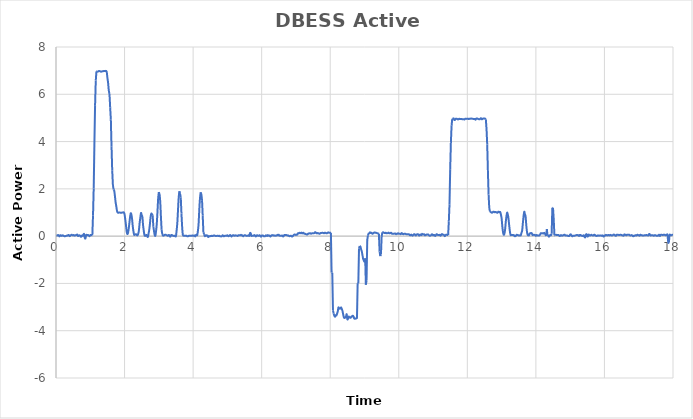
| Category | DBESS Active Power |
|---|---|
| 0.0 | -0.006 |
| 0.02 | 0.027 |
| 0.04 | 0.028 |
| 0.06 | 0.048 |
| 0.08 | 0.03 |
| 0.1 | -0.011 |
| 0.12 | 0.033 |
| 0.14 | 0.041 |
| 0.16 | 0.011 |
| 0.18 | 0.02 |
| 0.2 | 0.035 |
| 0.22 | 0.014 |
| 0.24 | 0.002 |
| 0.26 | -0.007 |
| 0.28 | 0.004 |
| 0.3 | 0.014 |
| 0.32 | 0.022 |
| 0.34 | 0.022 |
| 0.36 | 0.047 |
| 0.38 | 0.039 |
| 0.4 | 0 |
| 0.42 | 0.026 |
| 0.44 | 0.047 |
| 0.46 | 0.057 |
| 0.48 | 0.04 |
| 0.5 | 0.034 |
| 0.52 | 0.047 |
| 0.54 | 0.021 |
| 0.56 | 0.031 |
| 0.58 | 0.041 |
| 0.6 | 0.052 |
| 0.62 | 0.065 |
| 0.64 | 0.008 |
| 0.66 | 0.017 |
| 0.68 | 0.037 |
| 0.7 | 0.023 |
| 0.72 | -0.018 |
| 0.74 | -0.021 |
| 0.76 | 0.029 |
| 0.78 | 0.014 |
| 0.8 | 0.068 |
| 0.82 | 0.088 |
| 0.84 | -0.074 |
| 0.86 | -0.094 |
| 0.88 | 0.041 |
| 0.9 | 0.054 |
| 0.92 | 0.04 |
| 0.94 | 0.045 |
| 0.96 | 0.019 |
| 0.98 | -0.002 |
| 1.0 | 0.042 |
| 1.02 | 0.048 |
| 1.04 | 0.043 |
| 1.06 | 0.038 |
| 1.08 | 0.88 |
| 1.1 | 2.011 |
| 1.12 | 3.896 |
| 1.14 | 5.542 |
| 1.16 | 6.577 |
| 1.18 | 6.971 |
| 1.2 | 6.971 |
| 1.22 | 6.956 |
| 1.24 | 6.977 |
| 1.26 | 6.982 |
| 1.28 | 6.976 |
| 1.3 | 6.963 |
| 1.32 | 6.956 |
| 1.34 | 6.967 |
| 1.36 | 6.978 |
| 1.38 | 6.978 |
| 1.4 | 6.986 |
| 1.42 | 6.986 |
| 1.44 | 6.98 |
| 1.46 | 6.989 |
| 1.48 | 6.942 |
| 1.5 | 6.695 |
| 1.52 | 6.484 |
| 1.54 | 6.161 |
| 1.56 | 6.015 |
| 1.58 | 5.454 |
| 1.6 | 4.923 |
| 1.62 | 3.784 |
| 1.64 | 2.784 |
| 1.66 | 2.162 |
| 1.68 | 1.976 |
| 1.7 | 1.915 |
| 1.72 | 1.686 |
| 1.74 | 1.424 |
| 1.76 | 1.254 |
| 1.78 | 1.062 |
| 1.8 | 1.002 |
| 1.82 | 0.985 |
| 1.84 | 1.002 |
| 1.86 | 1 |
| 1.88 | 0.99 |
| 1.9 | 0.993 |
| 1.92 | 0.993 |
| 1.94 | 1 |
| 1.96 | 1.003 |
| 1.98 | 1.003 |
| 2.0 | 0.924 |
| 2.02 | 0.716 |
| 2.04 | 0.48 |
| 2.06 | 0.203 |
| 2.08 | 0.09 |
| 2.1 | 0.13 |
| 2.12 | 0.303 |
| 2.14 | 0.543 |
| 2.16 | 0.802 |
| 2.18 | 0.967 |
| 2.2 | 0.907 |
| 2.22 | 0.716 |
| 2.24 | 0.408 |
| 2.26 | 0.2 |
| 2.28 | 0.057 |
| 2.3 | 0.064 |
| 2.32 | 0.077 |
| 2.34 | 0.077 |
| 2.36 | 0.038 |
| 2.38 | 0.038 |
| 2.4 | 0.1 |
| 2.42 | 0.258 |
| 2.44 | 0.555 |
| 2.46 | 0.784 |
| 2.48 | 0.979 |
| 2.5 | 0.885 |
| 2.52 | 0.812 |
| 2.54 | 0.465 |
| 2.56 | 0.232 |
| 2.58 | 0.045 |
| 2.6 | 0.01 |
| 2.62 | 0.034 |
| 2.64 | 0.05 |
| 2.66 | 0.004 |
| 2.68 | -0.035 |
| 2.7 | 0.105 |
| 2.72 | 0.266 |
| 2.74 | 0.514 |
| 2.76 | 0.807 |
| 2.78 | 0.952 |
| 2.8 | 0.925 |
| 2.82 | 0.88 |
| 2.84 | 0.402 |
| 2.86 | 0.208 |
| 2.88 | 0.044 |
| 2.9 | 0.026 |
| 2.92 | 0.224 |
| 2.94 | 0.522 |
| 2.96 | 1.023 |
| 2.98 | 1.588 |
| 3.0 | 1.863 |
| 3.02 | 1.788 |
| 3.04 | 1.479 |
| 3.06 | 0.853 |
| 3.08 | 0.273 |
| 3.1 | 0.088 |
| 3.12 | 0.024 |
| 3.14 | 0.024 |
| 3.16 | 0.042 |
| 3.18 | 0.057 |
| 3.2 | 0.059 |
| 3.22 | 0.042 |
| 3.24 | 0.032 |
| 3.26 | 0.014 |
| 3.28 | 0.039 |
| 3.3 | 0.046 |
| 3.32 | -0.013 |
| 3.34 | -0.015 |
| 3.36 | 0.046 |
| 3.38 | 0.047 |
| 3.4 | 0.025 |
| 3.42 | 0.011 |
| 3.44 | 0.014 |
| 3.46 | 0.014 |
| 3.48 | -0.007 |
| 3.5 | 0.01 |
| 3.52 | 0.254 |
| 3.54 | 0.576 |
| 3.56 | 1.122 |
| 3.58 | 1.645 |
| 3.6 | 1.898 |
| 3.62 | 1.787 |
| 3.64 | 1.633 |
| 3.66 | 0.953 |
| 3.68 | 0.396 |
| 3.7 | 0.064 |
| 3.72 | 0.019 |
| 3.74 | 0.015 |
| 3.76 | 0.014 |
| 3.78 | 0.018 |
| 3.8 | 0.019 |
| 3.82 | 0.002 |
| 3.84 | -0.005 |
| 3.86 | 0.001 |
| 3.88 | 0.017 |
| 3.9 | 0.018 |
| 3.92 | 0.015 |
| 3.94 | 0.017 |
| 3.96 | 0.016 |
| 3.98 | 0.032 |
| 4.0 | 0.015 |
| 4.02 | 0.018 |
| 4.04 | 0.027 |
| 4.06 | -0.012 |
| 4.08 | 0.035 |
| 4.1 | 0.062 |
| 4.12 | 0.042 |
| 4.14 | 0.222 |
| 4.16 | 0.518 |
| 4.18 | 1.113 |
| 4.2 | 1.594 |
| 4.22 | 1.852 |
| 4.24 | 1.779 |
| 4.26 | 1.523 |
| 4.28 | 0.875 |
| 4.3 | 0.165 |
| 4.32 | 0.081 |
| 4.34 | 0.002 |
| 4.36 | 0.021 |
| 4.38 | 0.042 |
| 4.4 | 0.015 |
| 4.42 | 0.024 |
| 4.44 | -0.039 |
| 4.46 | 0.001 |
| 4.48 | -0.011 |
| 4.5 | 0.001 |
| 4.52 | 0.001 |
| 4.54 | 0.016 |
| 4.56 | 0.008 |
| 4.58 | 0.008 |
| 4.6 | 0.028 |
| 4.62 | 0.028 |
| 4.64 | 0.014 |
| 4.66 | 0.01 |
| 4.68 | 0.009 |
| 4.7 | 0.013 |
| 4.72 | 0.013 |
| 4.74 | 0.005 |
| 4.76 | 0.019 |
| 4.78 | -0.002 |
| 4.8 | -0.008 |
| 4.82 | -0.012 |
| 4.84 | -0.001 |
| 4.86 | 0.036 |
| 4.88 | 0.011 |
| 4.9 | -0.007 |
| 4.92 | 0.008 |
| 4.94 | 0.02 |
| 4.96 | 0.011 |
| 4.98 | 0.021 |
| 5.0 | 0.037 |
| 5.02 | 0.001 |
| 5.04 | 0.001 |
| 5.06 | 0.019 |
| 5.08 | 0.05 |
| 5.1 | 0.017 |
| 5.12 | -0.017 |
| 5.14 | 0.018 |
| 5.16 | 0.036 |
| 5.18 | 0.036 |
| 5.2 | 0.016 |
| 5.22 | 0.029 |
| 5.24 | 0.034 |
| 5.26 | 0.025 |
| 5.28 | 0.02 |
| 5.3 | 0.01 |
| 5.32 | 0.037 |
| 5.34 | 0.038 |
| 5.36 | 0.037 |
| 5.38 | 0.037 |
| 5.4 | 0.056 |
| 5.42 | 0.032 |
| 5.44 | 0.032 |
| 5.46 | -0.006 |
| 5.48 | 0.019 |
| 5.5 | 0.037 |
| 5.52 | 0.038 |
| 5.54 | 0.022 |
| 5.56 | 0.011 |
| 5.58 | 0.019 |
| 5.6 | 0.02 |
| 5.62 | 0.041 |
| 5.64 | 0.01 |
| 5.66 | 0.127 |
| 5.68 | 0.122 |
| 5.7 | 0.014 |
| 5.72 | 0.014 |
| 5.74 | 0.018 |
| 5.76 | 0.018 |
| 5.78 | 0.04 |
| 5.8 | 0.04 |
| 5.82 | -0.006 |
| 5.84 | -0.006 |
| 5.86 | 0.033 |
| 5.88 | 0.033 |
| 5.9 | 0.017 |
| 5.92 | 0.017 |
| 5.94 | 0.038 |
| 5.96 | 0.01 |
| 5.98 | -0.025 |
| 6.0 | 0.021 |
| 6.02 | 0.028 |
| 6.04 | 0.028 |
| 6.06 | -0.007 |
| 6.08 | -0.001 |
| 6.1 | -0.001 |
| 6.12 | 0.032 |
| 6.14 | 0.028 |
| 6.16 | 0.005 |
| 6.18 | 0.044 |
| 6.2 | 0.021 |
| 6.22 | 0.028 |
| 6.24 | 0.001 |
| 6.26 | -0.013 |
| 6.28 | 0.031 |
| 6.3 | 0.031 |
| 6.32 | 0.044 |
| 6.34 | 0.036 |
| 6.36 | 0.018 |
| 6.38 | 0.032 |
| 6.4 | 0.021 |
| 6.42 | 0.021 |
| 6.44 | 0.03 |
| 6.46 | 0.055 |
| 6.48 | 0.038 |
| 6.5 | 0.059 |
| 6.52 | 0.02 |
| 6.54 | 0.02 |
| 6.56 | 0.011 |
| 6.58 | 0.02 |
| 6.6 | 0.024 |
| 6.62 | -0.008 |
| 6.64 | -0.004 |
| 6.66 | 0.045 |
| 6.68 | 0.045 |
| 6.7 | 0.053 |
| 6.72 | 0.045 |
| 6.74 | 0.035 |
| 6.76 | 0.025 |
| 6.78 | 0.028 |
| 6.8 | 0.004 |
| 6.82 | -0.001 |
| 6.84 | 0.014 |
| 6.86 | 0.014 |
| 6.88 | -0.015 |
| 6.9 | -0.008 |
| 6.92 | 0.023 |
| 6.94 | 0.053 |
| 6.96 | 0.069 |
| 6.98 | 0.06 |
| 7.0 | 0.049 |
| 7.02 | 0.066 |
| 7.04 | 0.066 |
| 7.06 | 0.12 |
| 7.08 | 0.12 |
| 7.1 | 0.143 |
| 7.12 | 0.124 |
| 7.14 | 0.13 |
| 7.16 | 0.149 |
| 7.18 | 0.115 |
| 7.2 | 0.136 |
| 7.22 | 0.141 |
| 7.24 | 0.102 |
| 7.26 | 0.102 |
| 7.28 | 0.089 |
| 7.3 | 0.079 |
| 7.32 | 0.065 |
| 7.34 | 0.08 |
| 7.36 | 0.107 |
| 7.38 | 0.111 |
| 7.4 | 0.121 |
| 7.42 | 0.121 |
| 7.44 | 0.102 |
| 7.46 | 0.114 |
| 7.48 | 0.123 |
| 7.5 | 0.125 |
| 7.52 | 0.125 |
| 7.54 | 0.132 |
| 7.56 | 0.167 |
| 7.58 | 0.154 |
| 7.6 | 0.117 |
| 7.62 | 0.135 |
| 7.64 | 0.119 |
| 7.66 | 0.123 |
| 7.68 | 0.101 |
| 7.7 | 0.107 |
| 7.72 | 0.129 |
| 7.74 | 0.135 |
| 7.76 | 0.139 |
| 7.78 | 0.139 |
| 7.8 | 0.135 |
| 7.82 | 0.123 |
| 7.84 | 0.142 |
| 7.86 | 0.142 |
| 7.88 | 0.123 |
| 7.9 | 0.12 |
| 7.92 | 0.137 |
| 7.94 | 0.161 |
| 7.96 | 0.147 |
| 7.98 | 0.147 |
| 8.0 | 0.147 |
| 8.02 | 0.144 |
| 8.04 | -1.536 |
| 8.06 | -1.55 |
| 8.08 | -3.137 |
| 8.1 | -3.273 |
| 8.12 | -3.368 |
| 8.14 | -3.41 |
| 8.16 | -3.35 |
| 8.18 | -3.356 |
| 8.2 | -3.278 |
| 8.22 | -3.184 |
| 8.24 | -3.014 |
| 8.26 | -3.059 |
| 8.28 | -3.071 |
| 8.3 | -3.054 |
| 8.32 | -3.018 |
| 8.34 | -3.091 |
| 8.36 | -3.175 |
| 8.38 | -3.325 |
| 8.4 | -3.442 |
| 8.42 | -3.461 |
| 8.44 | -3.443 |
| 8.46 | -3.409 |
| 8.48 | -3.299 |
| 8.5 | -3.515 |
| 8.52 | -3.488 |
| 8.54 | -3.405 |
| 8.56 | -3.429 |
| 8.58 | -3.45 |
| 8.6 | -3.448 |
| 8.62 | -3.395 |
| 8.64 | -3.395 |
| 8.66 | -3.363 |
| 8.68 | -3.401 |
| 8.7 | -3.479 |
| 8.72 | -3.498 |
| 8.74 | -3.482 |
| 8.76 | -3.48 |
| 8.78 | -3.497 |
| 8.8 | -1.992 |
| 8.82 | -1.992 |
| 8.84 | -0.522 |
| 8.86 | -0.416 |
| 8.88 | -0.439 |
| 8.9 | -0.554 |
| 8.92 | -0.645 |
| 8.94 | -0.794 |
| 8.96 | -0.958 |
| 8.98 | -1.027 |
| 9.0 | -1.077 |
| 9.02 | -0.94 |
| 9.04 | -2.053 |
| 9.06 | -1.88 |
| 9.08 | -0.167 |
| 9.1 | 0.03 |
| 9.12 | 0.111 |
| 9.14 | 0.122 |
| 9.16 | 0.161 |
| 9.18 | 0.136 |
| 9.2 | 0.141 |
| 9.22 | 0.11 |
| 9.24 | 0.103 |
| 9.26 | 0.138 |
| 9.28 | 0.143 |
| 9.3 | 0.16 |
| 9.32 | 0.139 |
| 9.34 | 0.139 |
| 9.36 | 0.133 |
| 9.38 | 0.117 |
| 9.4 | 0.115 |
| 9.42 | 0.097 |
| 9.44 | -0.654 |
| 9.46 | -0.843 |
| 9.48 | -0.77 |
| 9.5 | -0.032 |
| 9.52 | 0.163 |
| 9.54 | 0.163 |
| 9.56 | 0.148 |
| 9.58 | 0.136 |
| 9.6 | 0.127 |
| 9.62 | 0.142 |
| 9.64 | 0.126 |
| 9.66 | 0.126 |
| 9.68 | 0.13 |
| 9.7 | 0.149 |
| 9.72 | 0.123 |
| 9.74 | 0.12 |
| 9.76 | 0.137 |
| 9.78 | 0.14 |
| 9.8 | 0.101 |
| 9.82 | 0.097 |
| 9.84 | 0.099 |
| 9.86 | 0.102 |
| 9.88 | 0.11 |
| 9.9 | 0.11 |
| 9.92 | 0.082 |
| 9.94 | 0.101 |
| 9.96 | 0.101 |
| 9.98 | 0.122 |
| 10.0 | 0.101 |
| 10.02 | 0.104 |
| 10.04 | 0.097 |
| 10.06 | 0.085 |
| 10.08 | 0.128 |
| 10.1 | 0.114 |
| 10.12 | 0.089 |
| 10.14 | 0.083 |
| 10.16 | 0.102 |
| 10.18 | 0.102 |
| 10.2 | 0.095 |
| 10.22 | 0.078 |
| 10.24 | 0.078 |
| 10.26 | 0.076 |
| 10.28 | 0.078 |
| 10.3 | 0.076 |
| 10.32 | 0.042 |
| 10.34 | 0.034 |
| 10.36 | 0.065 |
| 10.38 | 0.044 |
| 10.4 | 0.018 |
| 10.42 | 0.043 |
| 10.44 | 0.075 |
| 10.46 | 0.082 |
| 10.48 | 0.045 |
| 10.5 | 0.028 |
| 10.52 | 0.069 |
| 10.54 | 0.082 |
| 10.56 | 0.082 |
| 10.58 | 0.039 |
| 10.6 | 0.024 |
| 10.62 | 0.064 |
| 10.64 | 0.064 |
| 10.66 | 0.042 |
| 10.68 | 0.098 |
| 10.7 | 0.067 |
| 10.72 | 0.076 |
| 10.74 | 0.08 |
| 10.76 | 0.035 |
| 10.78 | 0.042 |
| 10.8 | 0.064 |
| 10.82 | 0.061 |
| 10.84 | 0.074 |
| 10.86 | 0.068 |
| 10.88 | 0.043 |
| 10.9 | 0.015 |
| 10.92 | 0.024 |
| 10.94 | 0.035 |
| 10.96 | 0.072 |
| 10.98 | 0.071 |
| 11.0 | 0.032 |
| 11.02 | 0.049 |
| 11.04 | 0.046 |
| 11.06 | 0.009 |
| 11.08 | 0.027 |
| 11.1 | 0.078 |
| 11.12 | 0.071 |
| 11.14 | 0.049 |
| 11.16 | 0.046 |
| 11.18 | 0.048 |
| 11.2 | 0.055 |
| 11.22 | 0.017 |
| 11.24 | 0.061 |
| 11.26 | 0.087 |
| 11.28 | 0.063 |
| 11.3 | 0.061 |
| 11.32 | 0.052 |
| 11.34 | 0 |
| 11.36 | 0.033 |
| 11.38 | 0.062 |
| 11.4 | 0.062 |
| 11.42 | 0.048 |
| 11.44 | 0.048 |
| 11.46 | 0.626 |
| 11.48 | 1.352 |
| 11.5 | 2.835 |
| 11.52 | 3.945 |
| 11.54 | 4.666 |
| 11.56 | 4.961 |
| 11.58 | 4.963 |
| 11.6 | 4.979 |
| 11.62 | 4.914 |
| 11.64 | 4.918 |
| 11.66 | 4.963 |
| 11.68 | 4.968 |
| 11.7 | 4.959 |
| 11.72 | 4.94 |
| 11.74 | 4.94 |
| 11.76 | 4.965 |
| 11.78 | 4.952 |
| 11.8 | 4.958 |
| 11.82 | 4.958 |
| 11.84 | 4.952 |
| 11.86 | 4.941 |
| 11.88 | 4.942 |
| 11.9 | 4.942 |
| 11.92 | 4.936 |
| 11.94 | 4.964 |
| 11.96 | 4.964 |
| 11.98 | 4.959 |
| 12.0 | 4.964 |
| 12.02 | 4.969 |
| 12.04 | 4.952 |
| 12.06 | 4.962 |
| 12.08 | 4.962 |
| 12.1 | 4.971 |
| 12.12 | 4.971 |
| 12.14 | 4.966 |
| 12.16 | 4.966 |
| 12.18 | 4.955 |
| 12.2 | 4.959 |
| 12.22 | 4.957 |
| 12.24 | 4.924 |
| 12.26 | 4.973 |
| 12.28 | 4.98 |
| 12.3 | 4.969 |
| 12.32 | 4.953 |
| 12.34 | 4.946 |
| 12.36 | 4.941 |
| 12.38 | 4.972 |
| 12.4 | 4.988 |
| 12.42 | 4.942 |
| 12.44 | 4.951 |
| 12.46 | 4.973 |
| 12.48 | 4.977 |
| 12.5 | 4.976 |
| 12.52 | 4.971 |
| 12.54 | 4.94 |
| 12.56 | 4.531 |
| 12.58 | 3.875 |
| 12.6 | 2.761 |
| 12.62 | 1.763 |
| 12.64 | 1.188 |
| 12.66 | 1.034 |
| 12.68 | 1.023 |
| 12.7 | 1.004 |
| 12.72 | 0.989 |
| 12.74 | 1.013 |
| 12.76 | 1.034 |
| 12.78 | 1.027 |
| 12.8 | 1.011 |
| 12.82 | 1.023 |
| 12.84 | 1.013 |
| 12.86 | 1.001 |
| 12.88 | 0.988 |
| 12.9 | 1.032 |
| 12.92 | 1.029 |
| 12.94 | 1.007 |
| 12.96 | 1.016 |
| 12.98 | 0.909 |
| 13.0 | 0.753 |
| 13.02 | 0.426 |
| 13.04 | 0.177 |
| 13.06 | 0.061 |
| 13.08 | 0.096 |
| 13.1 | 0.251 |
| 13.12 | 0.576 |
| 13.14 | 0.828 |
| 13.16 | 0.994 |
| 13.18 | 0.92 |
| 13.2 | 0.749 |
| 13.22 | 0.473 |
| 13.24 | 0.219 |
| 13.26 | 0.056 |
| 13.28 | 0.049 |
| 13.3 | 0.048 |
| 13.32 | 0.048 |
| 13.34 | 0.042 |
| 13.36 | 0.042 |
| 13.38 | 0.001 |
| 13.4 | 0.001 |
| 13.42 | 0.017 |
| 13.44 | 0.061 |
| 13.46 | 0.044 |
| 13.48 | 0.044 |
| 13.5 | 0.025 |
| 13.52 | 0.025 |
| 13.54 | 0.041 |
| 13.56 | 0.035 |
| 13.58 | 0.142 |
| 13.6 | 0.241 |
| 13.62 | 0.547 |
| 13.64 | 0.836 |
| 13.66 | 1.034 |
| 13.68 | 0.928 |
| 13.7 | 0.828 |
| 13.72 | 0.459 |
| 13.74 | 0.186 |
| 13.76 | 0.052 |
| 13.78 | 0.038 |
| 13.8 | 0.034 |
| 13.82 | 0.112 |
| 13.84 | 0.122 |
| 13.86 | 0.131 |
| 13.88 | 0.123 |
| 13.9 | 0.048 |
| 13.92 | 0.051 |
| 13.94 | 0.057 |
| 13.96 | 0.051 |
| 13.98 | 0.042 |
| 14.0 | 0.009 |
| 14.02 | 0.046 |
| 14.04 | 0.035 |
| 14.06 | 0.023 |
| 14.08 | 0.023 |
| 14.1 | 0.027 |
| 14.12 | 0.06 |
| 14.14 | 0.119 |
| 14.16 | 0.121 |
| 14.18 | 0.116 |
| 14.2 | 0.123 |
| 14.22 | 0.109 |
| 14.24 | 0.14 |
| 14.26 | 0.114 |
| 14.28 | 0.062 |
| 14.3 | 0.007 |
| 14.32 | 0.298 |
| 14.34 | 0.021 |
| 14.36 | 0.021 |
| 14.38 | -0.023 |
| 14.4 | 0.01 |
| 14.42 | 0.049 |
| 14.44 | 0.037 |
| 14.46 | 0.097 |
| 14.48 | 1.204 |
| 14.5 | 1.19 |
| 14.52 | 0.725 |
| 14.54 | 0.043 |
| 14.56 | 0.038 |
| 14.58 | 0.057 |
| 14.6 | 0.051 |
| 14.62 | 0.047 |
| 14.64 | 0.048 |
| 14.66 | 0.048 |
| 14.68 | 0.018 |
| 14.7 | 0.007 |
| 14.72 | 0.037 |
| 14.74 | 0.041 |
| 14.76 | 0.019 |
| 14.78 | 0.024 |
| 14.8 | 0.04 |
| 14.82 | 0.057 |
| 14.84 | 0.059 |
| 14.86 | 0.026 |
| 14.88 | 0.026 |
| 14.9 | 0.025 |
| 14.92 | 0.023 |
| 14.94 | 0.007 |
| 14.96 | 0.002 |
| 14.98 | 0.016 |
| 15.0 | 0.065 |
| 15.02 | 0.072 |
| 15.04 | 0.027 |
| 15.06 | -0.008 |
| 15.08 | 0.015 |
| 15.1 | 0.015 |
| 15.12 | 0.015 |
| 15.14 | 0.022 |
| 15.16 | 0.034 |
| 15.18 | 0.041 |
| 15.2 | 0.053 |
| 15.22 | 0.038 |
| 15.24 | 0.039 |
| 15.26 | 0.005 |
| 15.28 | 0.047 |
| 15.3 | 0.05 |
| 15.32 | 0.019 |
| 15.34 | 0.023 |
| 15.36 | 0.009 |
| 15.38 | 0.009 |
| 15.4 | 0.035 |
| 15.42 | -0.035 |
| 15.44 | -0.048 |
| 15.46 | 0.062 |
| 15.48 | 0.08 |
| 15.5 | -0.006 |
| 15.52 | -0.006 |
| 15.54 | 0.064 |
| 15.56 | 0.044 |
| 15.58 | 0.022 |
| 15.6 | 0.042 |
| 15.62 | 0.056 |
| 15.64 | 0.035 |
| 15.66 | 0.03 |
| 15.68 | 0.029 |
| 15.7 | 0.059 |
| 15.72 | 0.05 |
| 15.74 | 0.022 |
| 15.76 | 0.012 |
| 15.78 | 0.009 |
| 15.8 | 0.03 |
| 15.82 | 0.03 |
| 15.84 | 0.019 |
| 15.86 | 0.024 |
| 15.88 | 0.024 |
| 15.9 | 0.027 |
| 15.92 | 0.012 |
| 15.94 | 0.033 |
| 15.96 | 0.006 |
| 15.98 | -0.018 |
| 16.0 | 0.03 |
| 16.02 | 0.023 |
| 16.04 | 0.053 |
| 16.06 | 0.044 |
| 16.08 | 0.03 |
| 16.1 | 0.04 |
| 16.12 | 0.05 |
| 16.14 | 0.032 |
| 16.16 | 0.037 |
| 16.18 | 0.054 |
| 16.2 | 0.033 |
| 16.22 | 0.028 |
| 16.24 | 0.038 |
| 16.26 | 0.063 |
| 16.28 | 0.063 |
| 16.3 | 0.052 |
| 16.32 | 0.016 |
| 16.34 | 0.019 |
| 16.36 | 0.062 |
| 16.38 | 0.055 |
| 16.4 | 0.055 |
| 16.42 | 0.049 |
| 16.44 | 0.046 |
| 16.46 | 0.06 |
| 16.48 | 0.058 |
| 16.5 | 0.046 |
| 16.52 | 0.036 |
| 16.54 | 0.026 |
| 16.56 | 0.023 |
| 16.58 | 0.074 |
| 16.6 | 0.061 |
| 16.62 | 0.051 |
| 16.64 | 0.035 |
| 16.66 | 0.061 |
| 16.68 | 0.057 |
| 16.7 | 0.06 |
| 16.72 | 0.06 |
| 16.74 | 0.034 |
| 16.76 | 0.029 |
| 16.78 | 0.036 |
| 16.8 | 0.043 |
| 16.82 | 0.012 |
| 16.84 | -0.004 |
| 16.86 | 0.022 |
| 16.88 | 0.01 |
| 16.9 | 0.039 |
| 16.92 | 0.034 |
| 16.94 | 0.03 |
| 16.96 | 0.058 |
| 16.98 | 0.049 |
| 17.0 | 0.037 |
| 17.02 | 0.018 |
| 17.04 | 0.053 |
| 17.06 | 0.056 |
| 17.08 | 0.035 |
| 17.1 | 0.035 |
| 17.12 | 0.024 |
| 17.14 | 0.024 |
| 17.16 | 0.034 |
| 17.18 | 0.037 |
| 17.2 | 0.037 |
| 17.22 | 0.049 |
| 17.24 | 0.04 |
| 17.26 | 0.04 |
| 17.28 | 0.025 |
| 17.3 | 0.085 |
| 17.32 | 0.085 |
| 17.34 | 0.029 |
| 17.36 | 0.034 |
| 17.38 | 0.034 |
| 17.4 | 0.034 |
| 17.42 | 0.034 |
| 17.44 | 0.015 |
| 17.46 | 0.04 |
| 17.48 | 0.034 |
| 17.5 | 0.034 |
| 17.52 | 0.014 |
| 17.54 | 0.014 |
| 17.56 | 0.014 |
| 17.58 | 0.048 |
| 17.6 | 0.054 |
| 17.62 | 0.005 |
| 17.64 | 0.051 |
| 17.66 | 0.061 |
| 17.68 | 0.055 |
| 17.7 | 0.046 |
| 17.72 | 0.057 |
| 17.74 | 0.059 |
| 17.76 | 0.057 |
| 17.78 | 0.036 |
| 17.8 | 0.048 |
| 17.82 | 0.064 |
| 17.84 | 0.048 |
| 17.86 | -0.252 |
| 17.88 | -0.247 |
| 17.9 | 0.05 |
| 17.92 | 0.047 |
| 17.94 | 0.042 |
| 17.96 | 0.042 |
| 17.98 | 0.059 |
| 18.0 | 0.043 |